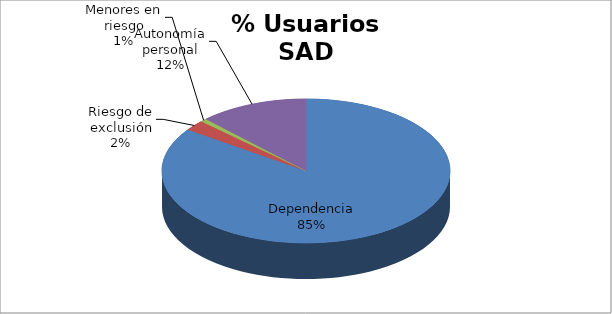
| Category | Series 0 |
|---|---|
| Dependencia | 4705 |
| Riesgo de exclusión | 129 |
| Menores en riesgo | 42 |
| Autonomía personal | 678 |